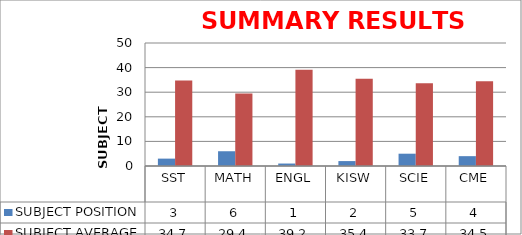
| Category | SUBJECT POSITION | SUBJECT AVERAGE |
|---|---|---|
| SST | 3 | 34.737 |
| MATH | 6 | 29.421 |
| ENGL | 1 | 39.158 |
| KISW | 2 | 35.421 |
| SCIE | 5 | 33.684 |
| CME | 4 | 34.474 |